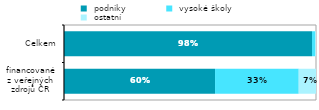
| Category |  podniky |  vysoké školy |  ostatní  |
|---|---|---|---|
| financované
z veřejných
zdrojů ČR | 0.599 | 0.332 | 0.069 |
| Celkem | 0.984 | 0.012 | 0.003 |